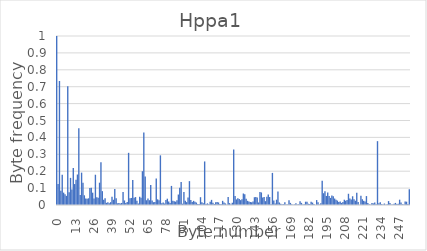
| Category | Series 0 |
|---|---|
| 0.0 | 1 |
| 1.0 | 0.124 |
| 2.0 | 0.734 |
| 3.0 | 0.084 |
| 4.0 | 0.179 |
| 5.0 | 0.073 |
| 6.0 | 0.063 |
| 7.0 | 0.054 |
| 8.0 | 0.703 |
| 9.0 | 0.076 |
| 10.0 | 0.161 |
| 11.0 | 0.092 |
| 12.0 | 0.219 |
| 13.0 | 0.124 |
| 14.0 | 0.15 |
| 15.0 | 0.18 |
| 16.0 | 0.454 |
| 17.0 | 0.058 |
| 18.0 | 0.192 |
| 19.0 | 0.131 |
| 20.0 | 0.057 |
| 21.0 | 0.038 |
| 22.0 | 0.037 |
| 23.0 | 0.04 |
| 24.0 | 0.101 |
| 25.0 | 0.102 |
| 26.0 | 0.073 |
| 27.0 | 0.038 |
| 28.0 | 0.179 |
| 29.0 | 0.045 |
| 30.0 | 0.043 |
| 31.0 | 0.132 |
| 32.0 | 0.253 |
| 33.0 | 0.082 |
| 34.0 | 0.032 |
| 35.0 | 0.04 |
| 36.0 | 0.013 |
| 37.0 | 0.016 |
| 38.0 | 0.01 |
| 39.0 | 0.017 |
| 40.0 | 0.049 |
| 41.0 | 0.031 |
| 42.0 | 0.094 |
| 43.0 | 0.04 |
| 44.0 | 0.01 |
| 45.0 | 0.011 |
| 46.0 | 0.009 |
| 47.0 | 0.012 |
| 48.0 | 0.077 |
| 49.0 | 0.027 |
| 50.0 | 0.012 |
| 51.0 | 0.018 |
| 52.0 | 0.309 |
| 53.0 | 0.04 |
| 54.0 | 0.042 |
| 55.0 | 0.149 |
| 56.0 | 0.043 |
| 57.0 | 0.047 |
| 58.0 | 0.026 |
| 59.0 | 0.008 |
| 60.0 | 0.049 |
| 61.0 | 0.043 |
| 62.0 | 0.2 |
| 63.0 | 0.43 |
| 64.0 | 0.168 |
| 65.0 | 0.028 |
| 66.0 | 0.039 |
| 67.0 | 0.028 |
| 68.0 | 0.118 |
| 69.0 | 0.026 |
| 70.0 | 0.017 |
| 71.0 | 0.017 |
| 72.0 | 0.157 |
| 73.0 | 0.033 |
| 74.0 | 0.028 |
| 75.0 | 0.294 |
| 76.0 | 0.01 |
| 77.0 | 0.015 |
| 78.0 | 0.009 |
| 79.0 | 0.029 |
| 80.0 | 0.037 |
| 81.0 | 0.021 |
| 82.0 | 0.012 |
| 83.0 | 0.113 |
| 84.0 | 0.025 |
| 85.0 | 0.022 |
| 86.0 | 0.02 |
| 87.0 | 0.029 |
| 88.0 | 0.062 |
| 89.0 | 0.102 |
| 90.0 | 0.136 |
| 91.0 | 0.008 |
| 92.0 | 0.076 |
| 93.0 | 0.025 |
| 94.0 | 0.017 |
| 95.0 | 0.044 |
| 96.0 | 0.141 |
| 97.0 | 0.029 |
| 98.0 | 0.018 |
| 99.0 | 0.025 |
| 100.0 | 0.02 |
| 101.0 | 0.015 |
| 102.0 | 0.007 |
| 103.0 | 0.006 |
| 104.0 | 0.046 |
| 105.0 | 0.016 |
| 106.0 | 0.01 |
| 107.0 | 0.258 |
| 108.0 | 0.007 |
| 109.0 | 0.01 |
| 110.0 | 0.004 |
| 111.0 | 0.019 |
| 112.0 | 0.03 |
| 113.0 | 0.013 |
| 114.0 | 0.006 |
| 115.0 | 0.016 |
| 116.0 | 0.018 |
| 117.0 | 0.015 |
| 118.0 | 0.006 |
| 119.0 | 0.005 |
| 120.0 | 0.025 |
| 121.0 | 0.015 |
| 122.0 | 0.009 |
| 123.0 | 0.001 |
| 124.0 | 0.047 |
| 125.0 | 0.011 |
| 126.0 | 0.003 |
| 127.0 | 0.014 |
| 128.0 | 0.328 |
| 129.0 | 0.053 |
| 130.0 | 0.033 |
| 131.0 | 0.04 |
| 132.0 | 0.035 |
| 133.0 | 0.029 |
| 134.0 | 0.033 |
| 135.0 | 0.068 |
| 136.0 | 0.063 |
| 137.0 | 0.037 |
| 138.0 | 0.025 |
| 139.0 | 0.02 |
| 140.0 | 0.017 |
| 141.0 | 0.016 |
| 142.0 | 0.021 |
| 143.0 | 0.046 |
| 144.0 | 0.047 |
| 145.0 | 0.045 |
| 146.0 | 0.015 |
| 147.0 | 0.078 |
| 148.0 | 0.074 |
| 149.0 | 0.044 |
| 150.0 | 0.047 |
| 151.0 | 0.023 |
| 152.0 | 0.048 |
| 153.0 | 0.062 |
| 154.0 | 0.047 |
| 155.0 | 0.004 |
| 156.0 | 0.19 |
| 157.0 | 0.027 |
| 158.0 | 0.009 |
| 159.0 | 0.031 |
| 160.0 | 0.079 |
| 161.0 | 0.015 |
| 162.0 | 0.008 |
| 163.0 | 0.004 |
| 164.0 | 0.005 |
| 165.0 | 0.016 |
| 166.0 | 0.004 |
| 167.0 | 0.003 |
| 168.0 | 0.027 |
| 169.0 | 0.013 |
| 170.0 | 0.004 |
| 171.0 | 0.002 |
| 172.0 | 0.004 |
| 173.0 | 0.01 |
| 174.0 | 0.003 |
| 175.0 | 0.004 |
| 176.0 | 0.022 |
| 177.0 | 0.013 |
| 178.0 | 0.004 |
| 179.0 | 0.005 |
| 180.0 | 0.019 |
| 181.0 | 0.019 |
| 182.0 | 0.008 |
| 183.0 | 0.006 |
| 184.0 | 0.019 |
| 185.0 | 0.014 |
| 186.0 | 0.006 |
| 187.0 | 0.001 |
| 188.0 | 0.029 |
| 189.0 | 0.017 |
| 190.0 | 0.003 |
| 191.0 | 0.01 |
| 192.0 | 0.143 |
| 193.0 | 0.07 |
| 194.0 | 0.081 |
| 195.0 | 0.054 |
| 196.0 | 0.074 |
| 197.0 | 0.053 |
| 198.0 | 0.042 |
| 199.0 | 0.056 |
| 200.0 | 0.052 |
| 201.0 | 0.038 |
| 202.0 | 0.031 |
| 203.0 | 0.026 |
| 204.0 | 0.017 |
| 205.0 | 0.021 |
| 206.0 | 0.012 |
| 207.0 | 0.018 |
| 208.0 | 0.031 |
| 209.0 | 0.025 |
| 210.0 | 0.03 |
| 211.0 | 0.066 |
| 212.0 | 0.038 |
| 213.0 | 0.033 |
| 214.0 | 0.052 |
| 215.0 | 0.034 |
| 216.0 | 0.025 |
| 217.0 | 0.072 |
| 218.0 | 0.017 |
| 219.0 | 0.001 |
| 220.0 | 0.055 |
| 221.0 | 0.034 |
| 222.0 | 0.025 |
| 223.0 | 0.02 |
| 224.0 | 0.053 |
| 225.0 | 0.012 |
| 226.0 | 0.004 |
| 227.0 | 0.002 |
| 228.0 | 0.011 |
| 229.0 | 0.009 |
| 230.0 | 0.014 |
| 231.0 | 0.005 |
| 232.0 | 0.378 |
| 233.0 | 0.011 |
| 234.0 | 0.017 |
| 235.0 | 0.005 |
| 236.0 | 0.003 |
| 237.0 | 0.009 |
| 238.0 | 0.001 |
| 239.0 | 0.004 |
| 240.0 | 0.023 |
| 241.0 | 0.012 |
| 242.0 | 0.003 |
| 243.0 | 0.003 |
| 244.0 | 0.007 |
| 245.0 | 0.012 |
| 246.0 | 0.006 |
| 247.0 | 0.007 |
| 248.0 | 0.031 |
| 249.0 | 0.015 |
| 250.0 | 0.005 |
| 251.0 | 0.003 |
| 252.0 | 0.021 |
| 253.0 | 0.02 |
| 254.0 | 0.006 |
| 255.0 | 0.093 |